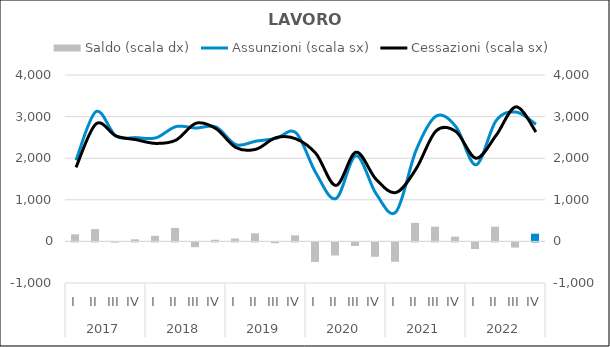
| Category | Saldo (scala dx) |
|---|---|
| 0 | 170 |
| 1 | 295 |
| 2 | -5 |
| 3 | 50 |
| 4 | 135 |
| 5 | 325 |
| 6 | -115 |
| 7 | 40 |
| 8 | 70 |
| 9 | 195 |
| 10 | -20 |
| 11 | 145 |
| 12 | -470 |
| 13 | -315 |
| 14 | -85 |
| 15 | -345 |
| 16 | -465 |
| 17 | 445 |
| 18 | 355 |
| 19 | 115 |
| 20 | -160 |
| 21 | 355 |
| 22 | -125 |
| 23 | 185 |